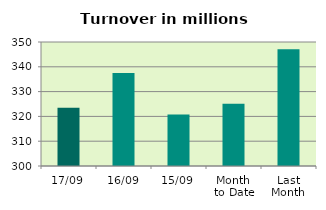
| Category | Series 0 |
|---|---|
| 17/09 | 323.53 |
| 16/09 | 337.547 |
| 15/09 | 320.806 |
| Month 
to Date | 325.067 |
| Last
Month | 347.074 |